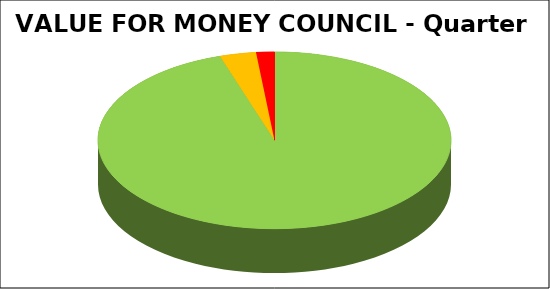
| Category | Series 0 |
|---|---|
| Green | 0.95 |
| Amber | 0.033 |
| Red | 0.017 |